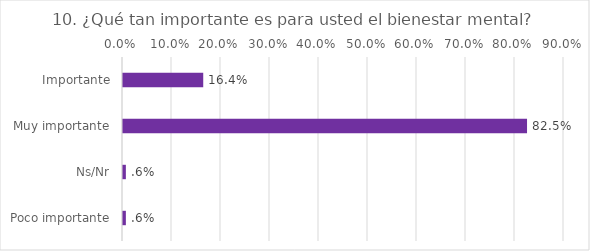
| Category | Series 0 |
|---|---|
| Importante | 0.164 |
| Muy importante | 0.825 |
| Ns/Nr | 0.006 |
| Poco importante | 0.006 |